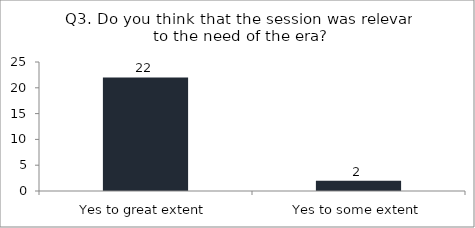
| Category | Q3. Do you think that the session was relevant to the need of the era? |
|---|---|
| Yes to great extent | 22 |
| Yes to some extent | 2 |